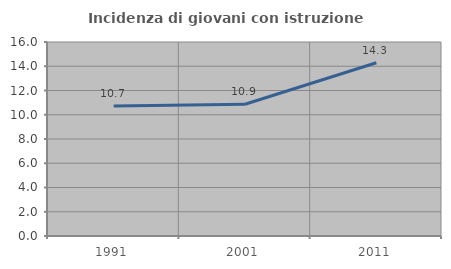
| Category | Incidenza di giovani con istruzione universitaria |
|---|---|
| 1991.0 | 10.714 |
| 2001.0 | 10.87 |
| 2011.0 | 14.286 |